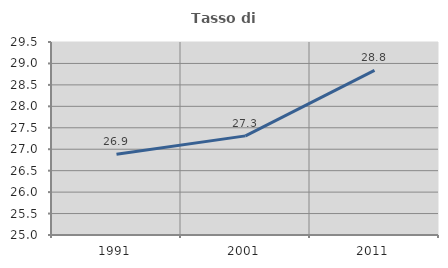
| Category | Tasso di occupazione   |
|---|---|
| 1991.0 | 26.882 |
| 2001.0 | 27.311 |
| 2011.0 | 28.838 |